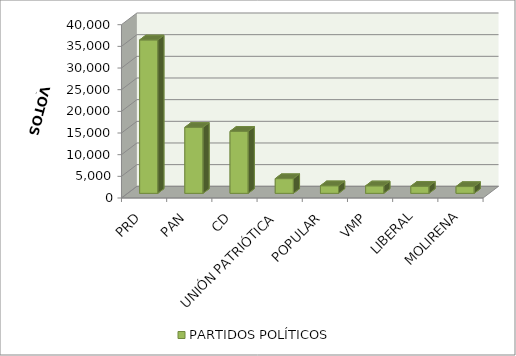
| Category | PARTIDOS POLÍTICOS |
|---|---|
| PRD | 35413 |
| PAN | 15237 |
| CD | 14321 |
| UNIÓN PATRIÓTICA | 3399 |
| POPULAR | 1754 |
| VMP | 1735 |
| LIBERAL | 1655 |
| MOLIRENA | 1568 |